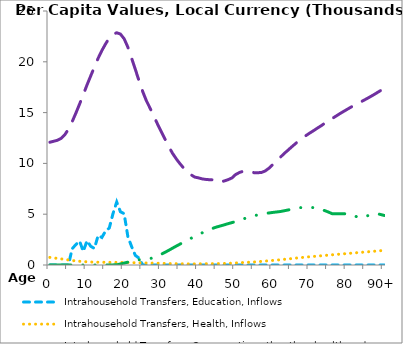
| Category | Intrahousehold Transfers, Education, Inflows | Intrahousehold Transfers, Health, Inflows | Intrahousehold Transfers, Consumption other than health and education, Inflows | Intrahousehold Transfers, Saving, Inflows |
|---|---|---|---|---|
| 0 | 0 | 749.173 | 12083.67 | 0.389 |
|  | 0 | 701.235 | 12176.987 | 0.539 |
| 2 | 0 | 653.296 | 12270.304 | 0.689 |
| 3 | 0 | 605.845 | 12460.444 | 0.809 |
| 4 | 0 | 550.086 | 12812.156 | 0.903 |
| 5 | 0 | 495.226 | 13361.349 | 0.788 |
| 6 | 1594.564 | 448.549 | 14100.695 | 0.657 |
| 7 | 2012.988 | 403.665 | 14945.641 | 0.512 |
| 8 | 2354.713 | 365.747 | 15838.374 | 0.372 |
| 9 | 1336.958 | 336.453 | 16769.417 | 0.227 |
| 10 | 2386.062 | 312.772 | 17719.83 | 0.253 |
| 11 | 1842.715 | 294.654 | 18610.926 | 0.344 |
| 12 | 1629.229 | 282.472 | 19491.18 | 2.311 |
| 13 | 2911.661 | 273.923 | 20348.715 | 3.661 |
| 14 | 2709.373 | 268.793 | 21107.779 | 5.15 |
| 15 | 3349.839 | 265.699 | 21760.494 | 7.193 |
| 16 | 3638.098 | 264.064 | 22339.967 | 9.515 |
| 17 | 5062.564 | 262.803 | 22715.155 | 11.039 |
| 18 | 6200.98 | 260.684 | 22853.625 | 18.049 |
| 19 | 5241.447 | 256.871 | 22729.986 | 100.308 |
| 20 | 5050.112 | 250.612 | 22266.754 | 188.249 |
| 21 | 2793.633 | 242.2 | 21444.007 | 279.572 |
| 22 | 1822.106 | 231.604 | 20370.64 | 386.286 |
| 23 | 953.927 | 223.504 | 19266.152 | 504.565 |
| 24 | 677.058 | 214.682 | 18145.667 | 512.562 |
| 25 | 0 | 206.538 | 17068.527 | 534.028 |
| 26 | 0 | 198.367 | 16156.1 | 577.882 |
| 27 | 0 | 190.905 | 15423.65 | 635.373 |
| 28 | 0 | 180.761 | 14646.715 | 718.335 |
| 29 | 0 | 170.683 | 13860.635 | 873.918 |
| 30 | 0 | 161.121 | 13128.129 | 1057.393 |
| 31 | 0 | 151.905 | 12399.863 | 1247.547 |
| 32 | 0 | 143.527 | 11673.379 | 1442.554 |
| 33 | 0 | 136.197 | 11007.023 | 1651.579 |
| 34 | 0 | 130.126 | 10465.212 | 1852.39 |
| 35 | 0 | 123.79 | 9982.107 | 2048.906 |
| 36 | 0 | 118.433 | 9553.315 | 2253.714 |
| 37 | 0 | 114.04 | 9170.898 | 2454.783 |
| 38 | 0 | 111.779 | 8881.333 | 2628.018 |
| 39 | 0 | 111.335 | 8652.876 | 2811.908 |
| 40 | 0 | 114.185 | 8577.182 | 2990.333 |
| 41 | 0 | 119.083 | 8474.972 | 3165.145 |
| 42 | 0 | 125.004 | 8422.44 | 3328.333 |
| 43 | 0 | 129.698 | 8394.223 | 3482.692 |
| 44 | 0 | 133.019 | 8380.306 | 3626.617 |
| 45 | 0 | 135.607 | 8200.339 | 3750.094 |
| 46 | 0 | 140.71 | 8186.858 | 3853.522 |
| 47 | 0 | 149.604 | 8274.618 | 3957.965 |
| 48 | 0 | 161.667 | 8403.579 | 4070.784 |
| 49 | 0 | 180.517 | 8563.36 | 4170.992 |
| 50 | 0 | 203.299 | 8899.152 | 4284.013 |
| 51 | 0 | 224.175 | 9096.701 | 4406.476 |
| 52 | 0 | 241.207 | 9223.313 | 4528.91 |
| 53 | 0 | 258.579 | 9257.981 | 4640.762 |
| 54 | 0 | 278.566 | 9212.13 | 4752.977 |
| 55 | 0 | 298.603 | 9081.056 | 4848.107 |
| 56 | 0 | 325.886 | 9082.587 | 4927.608 |
| 57 | 0 | 356.589 | 9110.779 | 5001.527 |
| 58 | 0 | 389.124 | 9258.961 | 5068.008 |
| 59 | 0 | 416.635 | 9531.038 | 5123.096 |
| 60 | 0 | 450.304 | 9879.122 | 5172.434 |
| 61 | 0 | 482.896 | 10227.837 | 5219.14 |
| 62 | 0 | 515.644 | 10583.407 | 5260.034 |
| 63 | 0 | 553.252 | 10945.406 | 5332.018 |
| 64 | 0 | 593.35 | 11263.48 | 5406.411 |
| 65 | 0 | 628.334 | 11591.384 | 5479.165 |
| 66 | 0 | 668.72 | 11904.722 | 5556.19 |
| 67 | 0 | 709.561 | 12224.382 | 5626.87 |
| 68 | 0 | 744.628 | 12496.848 | 5665.943 |
| 69 | 0 | 779.036 | 12752.908 | 5681.03 |
| 70 | 0 | 814.095 | 12994.28 | 5669.524 |
| 71 | 0 | 843.107 | 13224.003 | 5644.735 |
| 72 | 0 | 873.159 | 13464.643 | 5576.535 |
| 73 | 0 | 905.62 | 13695.842 | 5469.255 |
| 74 | 0 | 938.032 | 13945.4 | 5354.371 |
| 75 | 0 | 970.105 | 14187.252 | 5211.304 |
| 76 | 0 | 1001.754 | 14417.963 | 5049.788 |
| 77 | 0 | 1033.494 | 14643.534 | 5045.747 |
| 78 | 0 | 1064.558 | 14878.17 | 5048.019 |
| 79 | 0 | 1095.898 | 15095.824 | 5039.073 |
| 80 | 0 | 1127.239 | 15311.057 | 5047.944 |
| 81 | 0 | 1158.579 | 15522.913 | 5013.214 |
| 82 | 0 | 1189.92 | 15723.165 | 4851.126 |
| 83 | 0 | 1221.26 | 15918.988 | 4674.545 |
| 84 | 0 | 1252.601 | 16111.412 | 4692.352 |
| 85 | 0 | 1283.941 | 16305.842 | 4797.89 |
| 86 | 0 | 1315.282 | 16506.392 | 4894.938 |
| 87 | 0 | 1346.622 | 16715.584 | 4996.526 |
| 88 | 0 | 1377.963 | 16935.728 | 5072.055 |
| 89 | 0 | 1409.303 | 17159.773 | 4974.78 |
| 90+ | 0 | 1440.644 | 17383.818 | 4877.505 |